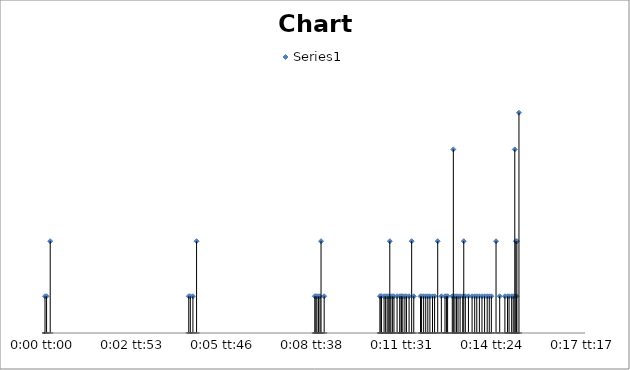
| Category | Series 0 |
|---|---|
| 0.0 | 2 |
| 3.472222222222765e-05 | 2 |
| 0.00011574074074074958 | 5 |
| 0.003194444444444444 | 2 |
| 0.003229166666666672 | 2 |
| 0.0032870370370370328 | 2 |
| 0.0033680555555555686 | 5 |
| 0.005995370370370373 | 2 |
| 0.00601851851851852 | 2 |
| 0.006041666666666667 | 2 |
| 0.006076388888888895 | 2 |
| 0.006111111111111109 | 2 |
| 0.006134259259259256 | 5 |
| 0.006203703703703711 | 2 |
| 0.007442129629629632 | 2 |
| 0.007465277777777779 | 2 |
| 0.0074768518518518595 | 2 |
| 0.00753472222222222 | 2 |
| 0.007569444444444448 | 2 |
| 0.007604166666666676 | 2 |
| 0.007638888888888903 | 2 |
| 0.007662037037037037 | 5 |
| 0.007685185185185184 | 2 |
| 0.0077199074074074114 | 2 |
| 0.007754629629629625 | 2 |
| 0.007916666666666669 | 2 |
| 0.00782407407407408 | 2 |
| 0.007881944444444455 | 2 |
| 0.007916666666666669 | 2 |
| 0.007951388888888897 | 2 |
| 0.007997685185185177 | 2 |
| 0.008032407407407405 | 2 |
| 0.008090277777777793 | 2 |
| 0.008148148148148154 | 5 |
| 0.008194444444444449 | 2 |
| 0.008344907407407426 | 2 |
| 0.00836805555555556 | 2 |
| 0.008414351851851853 | 2 |
| 0.008460648148148148 | 2 |
| 0.008506944444444442 | 2 |
| 0.00855324074074075 | 2 |
| 0.008611111111111111 | 2 |
| 0.00865740740740742 | 2 |
| 0.008726851851851847 | 5 |
| 0.008807870370370383 | 2 |
| 0.00888888888888889 | 2 |
| 0.008923611111111118 | 2 |
| 0.008946759259259252 | 2 |
| 0.009050925925925934 | 2 |
| 0.009074074074074068 | 10 |
| 0.009108796296296295 | 2 |
| 0.009143518518518523 | 2 |
| 0.009178240740740737 | 2 |
| 0.009224537037037045 | 2 |
| 0.00928240740740742 | 2 |
| 0.009305555555555553 | 5 |
| 0.00934027777777778 | 2 |
| 0.009409722222222222 | 2 |
| 0.009490740740740744 | 2 |
| 0.009548611111111105 | 2 |
| 0.009594907407407413 | 2 |
| 0.009652777777777774 | 2 |
| 0.009710648148148149 | 2 |
| 0.00976851851851851 | 2 |
| 0.009826388888888898 | 2 |
| 0.009872685185185179 | 2 |
| 0.009918981481481487 | 2 |
| 0.010023148148148142 | 5 |
| 0.010104166666666664 | 2 |
| 0.010219907407407414 | 2 |
| 0.010277777777777775 | 2 |
| 0.010312500000000002 | 2 |
| 0.010370370370370363 | 2 |
| 0.01040509259259259 | 2 |
| 0.010439814814814818 | 10 |
| 0.01046296296296298 | 5 |
| 0.010474537037037032 | 2 |
| 0.010486111111111127 | 5 |
| 0.010532407407407407 | 12 |